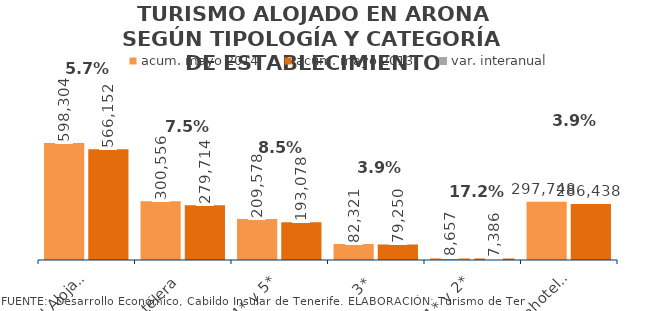
| Category | acum. mayo 2014 | acum. mayo 2013 |
|---|---|---|
| Total Alojados | 598304 | 566152 |
| Hotelera | 300556 | 279714 |
| 4* y 5* | 209578 | 193078 |
| 3* | 82321 | 79250 |
| 1* y 2* | 8657 | 7386 |
| Extrahotelera | 297748 | 286438 |